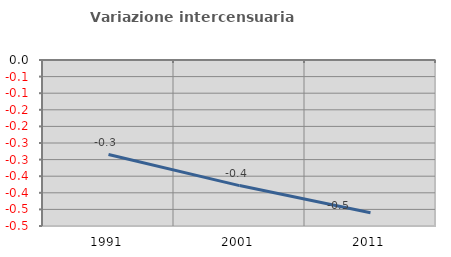
| Category | Variazione intercensuaria annua |
|---|---|
| 1991.0 | -0.285 |
| 2001.0 | -0.378 |
| 2011.0 | -0.46 |